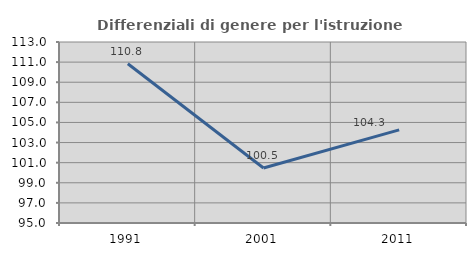
| Category | Differenziali di genere per l'istruzione superiore |
|---|---|
| 1991.0 | 110.843 |
| 2001.0 | 100.47 |
| 2011.0 | 104.263 |